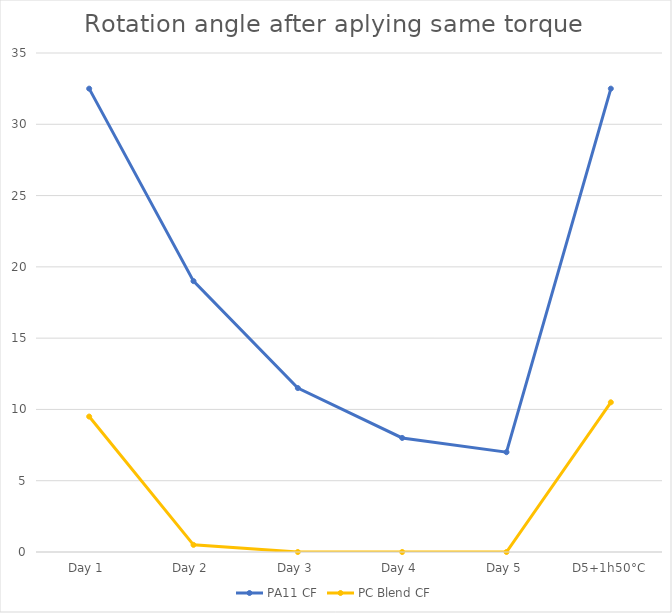
| Category | PA11 CF | PC Blend CF |
|---|---|---|
| Day 1 | 32.5 | 9.5 |
| Day 2 | 19 | 0.5 |
| Day 3 | 11.5 | 0 |
| Day 4 | 8 | 0 |
| Day 5 | 7 | 0 |
| D5+1h50°C | 32.5 | 10.5 |